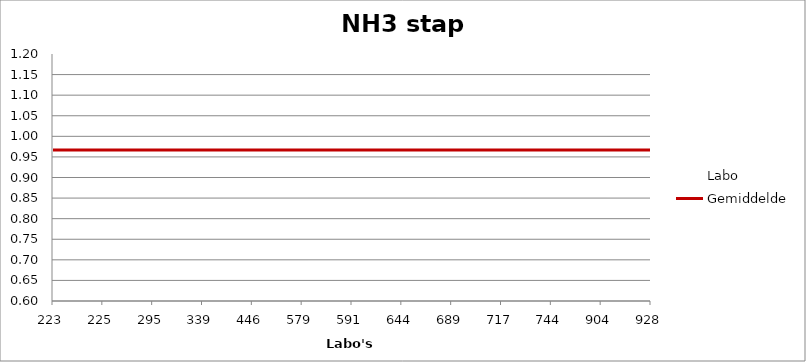
| Category | Labo | Gemiddelde |
|---|---|---|
| 223.0 | 0.801 | 0.967 |
| 225.0 | 1.072 | 0.967 |
| 295.0 | 0.976 | 0.967 |
| 339.0 | 0.973 | 0.967 |
| 446.0 | 0.956 | 0.967 |
| 579.0 | 1.059 | 0.967 |
| 591.0 | 1.073 | 0.967 |
| 644.0 | 0.985 | 0.967 |
| 689.0 | 0.627 | 0.967 |
| 717.0 | 1.028 | 0.967 |
| 744.0 | 0.978 | 0.967 |
| 904.0 | 0.743 | 0.967 |
| 928.0 | 1.18 | 0.967 |